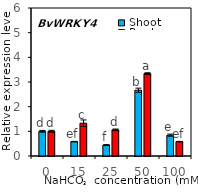
| Category | Shoot | Root |
|---|---|---|
| 0.0 | 1.001 | 1.002 |
| 15.0 | 0.584 | 1.329 |
| 25.0 | 0.442 | 1.06 |
| 50.0 | 2.666 | 3.341 |
| 100.0 | 0.843 | 0.584 |